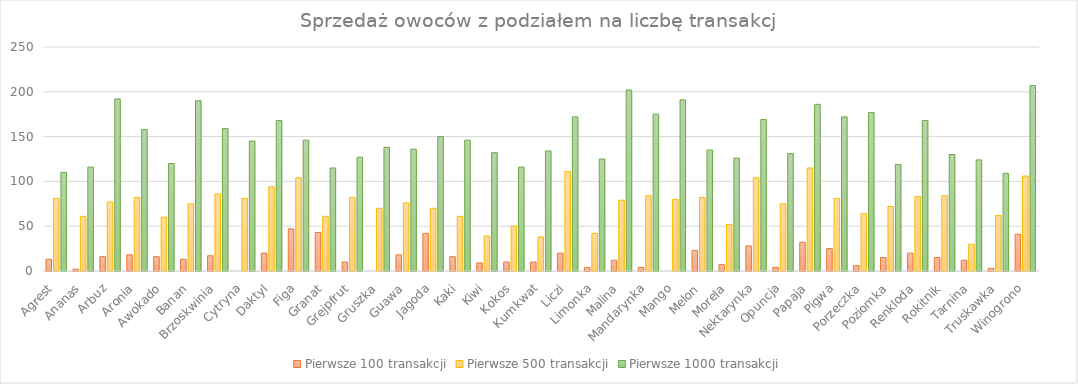
| Category | Pierwsze 100 transakcji | Pierwsze 500 transakcji | Pierwsze 1000 transakcji |
|---|---|---|---|
| Agrest | 13 | 81 | 110 |
| Ananas | 2 | 61 | 116 |
| Arbuz | 16 | 77 | 192 |
| Aronia | 18 | 82 | 158 |
| Awokado | 16 | 60 | 120 |
| Banan | 13 | 75 | 190 |
| Brzoskwinia | 17 | 86 | 159 |
| Cytryna | 0 | 81 | 145 |
| Daktyl | 20 | 94 | 168 |
| Figa | 47 | 104 | 146 |
| Granat | 43 | 61 | 115 |
| Grejpfrut | 10 | 82 | 127 |
| Gruszka | 0 | 70 | 138 |
| Guawa | 18 | 76 | 136 |
| Jagoda | 42 | 70 | 150 |
| Kaki | 16 | 61 | 146 |
| Kiwi | 9 | 39 | 132 |
| Kokos | 10 | 50 | 116 |
| Kumkwat | 10 | 38 | 134 |
| Liczi | 20 | 111 | 172 |
| Limonka | 4 | 42 | 125 |
| Malina | 12 | 79 | 202 |
| Mandarynka | 4 | 84 | 175 |
| Mango | 0 | 80 | 191 |
| Melon | 23 | 82 | 135 |
| Morela | 7 | 52 | 126 |
| Nektarynka | 28 | 104 | 169 |
| Opuncja | 4 | 75 | 131 |
| Papaja | 32 | 115 | 186 |
| Pigwa | 25 | 81 | 172 |
| Porzeczka | 6 | 64 | 177 |
| Poziomka | 15 | 72 | 119 |
| Renkloda | 20 | 83 | 168 |
| Rokitnik | 15 | 84 | 130 |
| Tarnina | 12 | 30 | 124 |
| Truskawka | 3 | 62 | 109 |
| Winogrono | 41 | 106 | 207 |